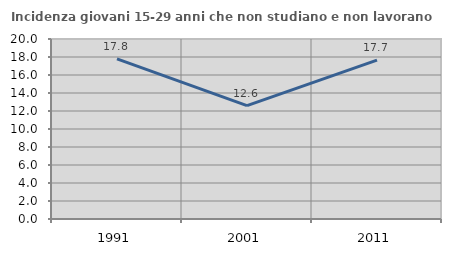
| Category | Incidenza giovani 15-29 anni che non studiano e non lavorano  |
|---|---|
| 1991.0 | 17.79 |
| 2001.0 | 12.598 |
| 2011.0 | 17.652 |